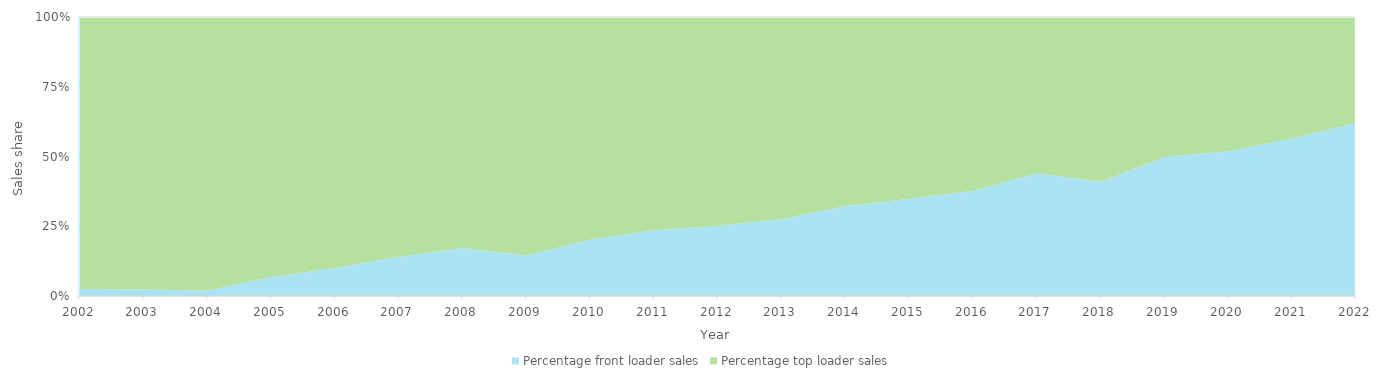
| Category | Percentage front loader sales | Percentage top loader sales |
|---|---|---|
| 2002.0 | 0.025 | 0.975 |
| 2003.0 | 0.023 | 0.977 |
| 2004.0 | 0.019 | 0.981 |
| 2005.0 | 0.068 | 0.932 |
| 2006.0 | 0.1 | 0.9 |
| 2007.0 | 0.14 | 0.86 |
| 2008.0 | 0.172 | 0.828 |
| 2009.0 | 0.145 | 0.855 |
| 2010.0 | 0.202 | 0.798 |
| 2011.0 | 0.236 | 0.764 |
| 2012.0 | 0.252 | 0.748 |
| 2013.0 | 0.276 | 0.724 |
| 2014.0 | 0.322 | 0.678 |
| 2015.0 | 0.348 | 0.652 |
| 2016.0 | 0.377 | 0.623 |
| 2017.0 | 0.44 | 0.56 |
| 2018.0 | 0.41 | 0.59 |
| 2019.0 | 0.498 | 0.502 |
| 2020.0 | 0.518 | 0.482 |
| 2021.0 | 0.565 | 0.435 |
| 2022.0 | 0.62 | 0.38 |